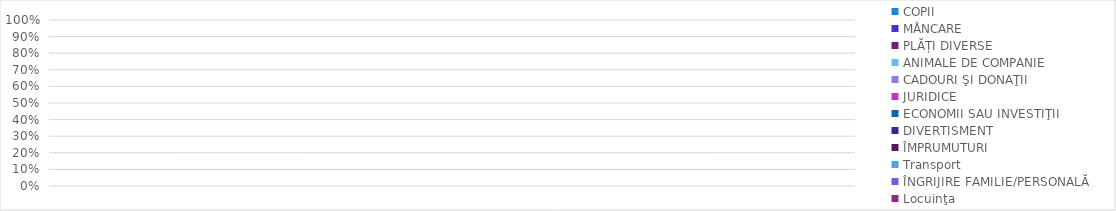
| Category | Locuinţa | ÎNGRIJIRE FAMILIE/PERSONALĂ | Transport | ÎMPRUMUTURI | DIVERTISMENT | ECONOMII SAU INVESTIŢII | JURIDICE | CADOURI ŞI DONAŢII | ANIMALE DE COMPANIE | PLĂȚI DIVERSE | MÂNCARE | COPII |
|---|---|---|---|---|---|---|---|---|---|---|---|---|
| Ian | 0 | 0 | 0 | 0 | 0 | 0 | 0 | 0 | 0 | 0 | 0 | 0 |
| Feb | 0 | 0 | 0 | 0 | 0 | 0 | 0 | 0 | 0 | 0 | 0 | 0 |
| Mar | 0 | 0 | 0 | 0 | 0 | 0 | 0 | 0 | 0 | 0 | 0 | 0 |
| Apr | 0 | 0 | 0 | 0 | 0 | 0 | 0 | 0 | 0 | 0 | 0 | 0 |
| Mai | 0 | 0 | 0 | 0 | 0 | 0 | 0 | 0 | 0 | 0 | 0 | 0 |
| Iun | 0 | 0 | 0 | 0 | 0 | 0 | 0 | 0 | 0 | 0 | 0 | 0 |
| Iul | 0 | 0 | 0 | 0 | 0 | 0 | 0 | 0 | 0 | 0 | 0 | 0 |
| Aug | 0 | 0 | 0 | 0 | 0 | 0 | 0 | 0 | 0 | 0 | 0 | 0 |
| Sep | 0 | 0 | 0 | 0 | 0 | 0 | 0 | 0 | 0 | 0 | 0 | 0 |
| Oct | 0 | 0 | 0 | 0 | 0 | 0 | 0 | 0 | 0 | 0 | 0 | 0 |
| Nov | 0 | 0 | 0 | 0 | 0 | 0 | 0 | 0 | 0 | 0 | 0 | 0 |
| Dec | 0 | 0 | 0 | 0 | 0 | 0 | 0 | 0 | 0 | 0 | 0 | 0 |